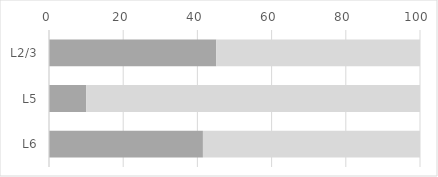
| Category | Series 0 | Series 1 |
|---|---|---|
| L2/3 | 45.082 | 54.918 |
| L5 | 10.047 | 89.953 |
| L6 | 41.488 | 58.512 |